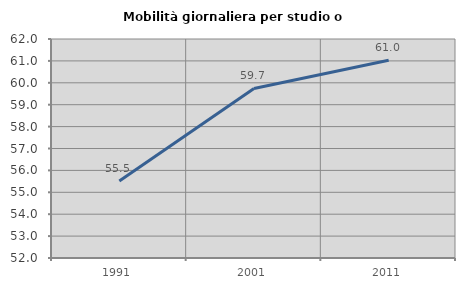
| Category | Mobilità giornaliera per studio o lavoro |
|---|---|
| 1991.0 | 55.519 |
| 2001.0 | 59.74 |
| 2011.0 | 61.032 |